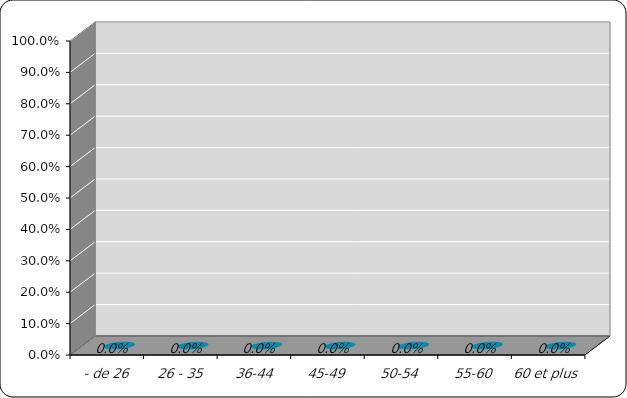
| Category | effectif |
|---|---|
|  - de 26 | 0 |
|  26 - 35 | 0 |
|  36-44 | 0 |
| 45-49 | 0 |
| 50-54 | 0 |
| 55-60 | 0 |
| 60 et plus | 0 |